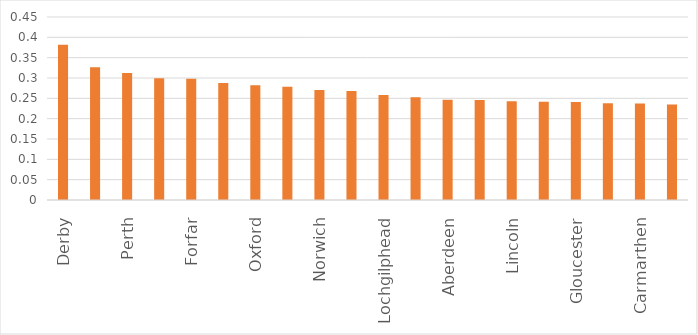
| Category | mean |
|---|---|
| Derby | 0.382 |
| Inverness | 0.326 |
| Perth | 0.312 |
| Ballymena | 0.299 |
| Forfar | 0.298 |
| Sittingbourne | 0.287 |
| Oxford | 0.282 |
| Larkhall | 0.278 |
| Norwich | 0.271 |
| Kilmarnock | 0.268 |
| Lochgilphead | 0.258 |
| Armagh | 0.252 |
| Aberdeen | 0.247 |
| Haverfordwest | 0.246 |
| Lincoln | 0.243 |
| Stretford | 0.241 |
| Gloucester | 0.241 |
| Caernarfon | 0.238 |
| Carmarthen | 0.237 |
| Uxbridge | 0.235 |